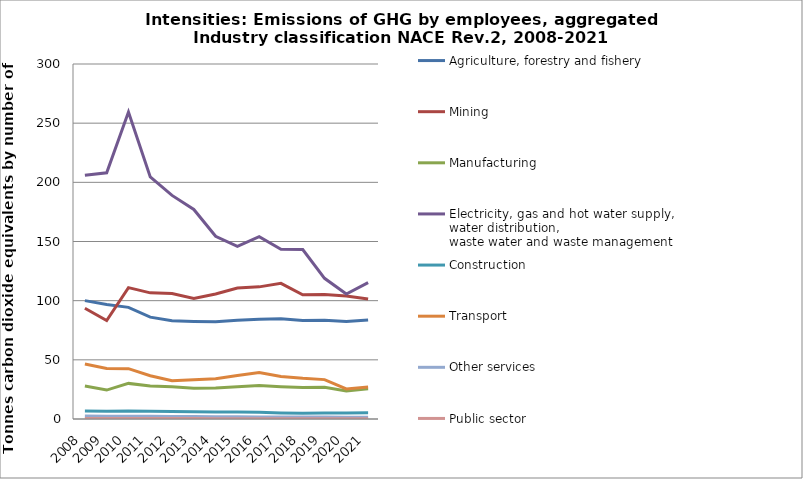
| Category | Agriculture, forestry and fishery | Mining | Manufacturing | Electricity, gas and hot water supply, water distribution, 
waste water and waste management | Construction | Transport | Other services | Public sector |
|---|---|---|---|---|---|---|---|---|
| 2008 | 100.044 | 93.541 | 27.841 | 205.91 | 6.717 | 46.428 | 2.469 | 0.44 |
| 2009 | 96.721 | 83.244 | 24.446 | 208.088 | 6.607 | 42.606 | 2.348 | 0.425 |
| 2010 | 94.364 | 111.029 | 30.097 | 259.41 | 6.841 | 42.509 | 2.412 | 0.441 |
| 2011 | 86.048 | 106.617 | 27.987 | 204.532 | 6.578 | 36.527 | 2.339 | 0.391 |
| 2012 | 82.943 | 106.066 | 27.181 | 188.963 | 6.294 | 32.252 | 2.117 | 0.396 |
| 2013 | 82.378 | 101.946 | 26.07 | 177.05 | 6.169 | 33.243 | 2.05 | 0.342 |
| 2014 | 82.186 | 105.586 | 26.163 | 154.412 | 5.836 | 33.943 | 1.889 | 0.317 |
| 2015 | 83.368 | 110.652 | 27.228 | 145.892 | 5.857 | 36.682 | 1.847 | 0.306 |
| 2016 | 84.216 | 111.667 | 28.213 | 154.038 | 5.792 | 39.284 | 1.745 | 0.291 |
| 2017 | 84.634 | 114.63 | 27.231 | 143.484 | 5.155 | 35.937 | 1.674 | 0.274 |
| 2018 | 83.282 | 104.968 | 26.573 | 143.17 | 4.912 | 34.394 | 1.622 | 0.265 |
| 2019 | 83.528 | 105.217 | 26.732 | 118.873 | 5.104 | 33.282 | 1.616 | 0.282 |
| 2020 | 82.344 | 103.984 | 23.575 | 105.602 | 5.12 | 25.383 | 1.524 | 0.273 |
| 2021 | 83.752 | 101.38 | 25.635 | 115.245 | 5.192 | 27.049 | 1.468 | 0.267 |